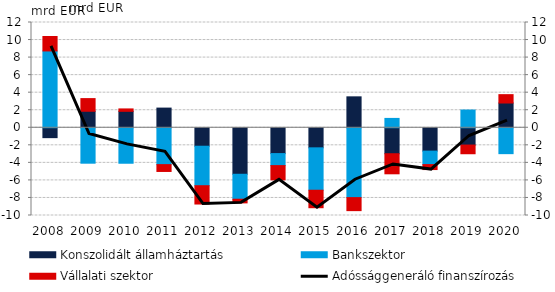
| Category | Konszolidált államháztartás | Bankszektor | Vállalati szektor |
|---|---|---|---|
| 2008.0 | -1.125 | 8.757 | 1.647 |
| 2009.0 | 1.882 | -4.038 | 1.444 |
| 2010.0 | 1.875 | -4.043 | 0.274 |
| 2011.0 | 2.243 | -4.2 | -0.78 |
| 2012.0 | -2.104 | -4.501 | -2.087 |
| 2013.0 | -5.3 | -2.846 | -0.416 |
| 2014.0 | -2.942 | -1.37 | -1.625 |
| 2015.0 | -2.287 | -4.833 | -1.993 |
| 2016.0 | 3.526 | -7.961 | -1.485 |
| 2017.0 | -2.959 | 1.067 | -2.287 |
| 2018.0 | -2.66 | -1.537 | -0.566 |
| 2019.0 | -1.97 | 2.023 | -0.99 |
| 2020.0 | 2.822 | -2.95 | 0.953 |